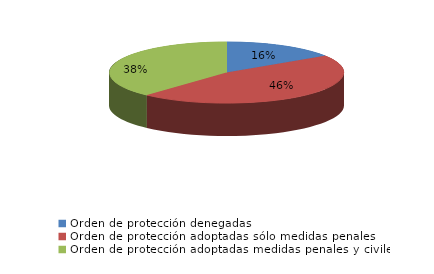
| Category | Series 0 |
|---|---|
| Orden de protección denegadas | 12 |
| Orden de protección adoptadas sólo medidas penales | 35 |
| Orden de protección adoptadas medidas penales y civiles | 29 |